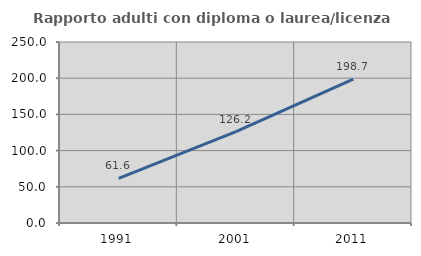
| Category | Rapporto adulti con diploma o laurea/licenza media  |
|---|---|
| 1991.0 | 61.58 |
| 2001.0 | 126.151 |
| 2011.0 | 198.711 |